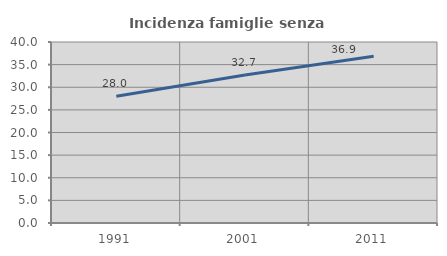
| Category | Incidenza famiglie senza nuclei |
|---|---|
| 1991.0 | 28 |
| 2001.0 | 32.718 |
| 2011.0 | 36.861 |